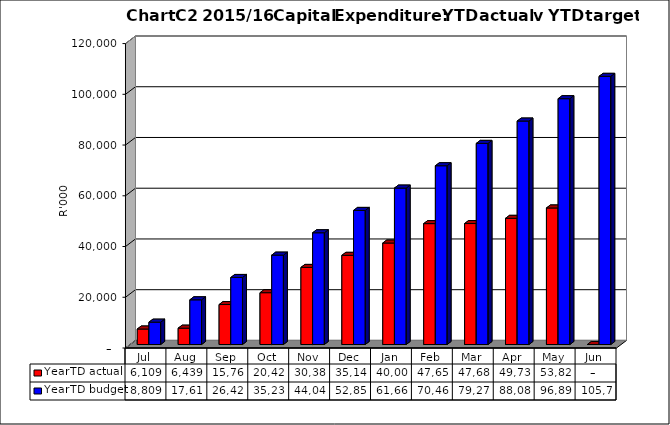
| Category | YearTD actual | YearTD budget |
|---|---|---|
| Jul | 6108587 | 8808585.26 |
| Aug | 6439262 | 17617170.52 |
| Sep | 15760781 | 26425755.78 |
| Oct | 20424714 | 35234341.04 |
| Nov | 30383869 | 44042926.3 |
| Dec | 35145694 | 52851511.56 |
| Jan | 40003745 | 61660096.821 |
| Feb | 47652521 | 70468682.081 |
| Mar | 47685459 | 79277267.341 |
| Apr | 49734294 | 88085852.601 |
| May | 53821249.53 | 96894437.861 |
| Jun | 0 | 105703023.121 |